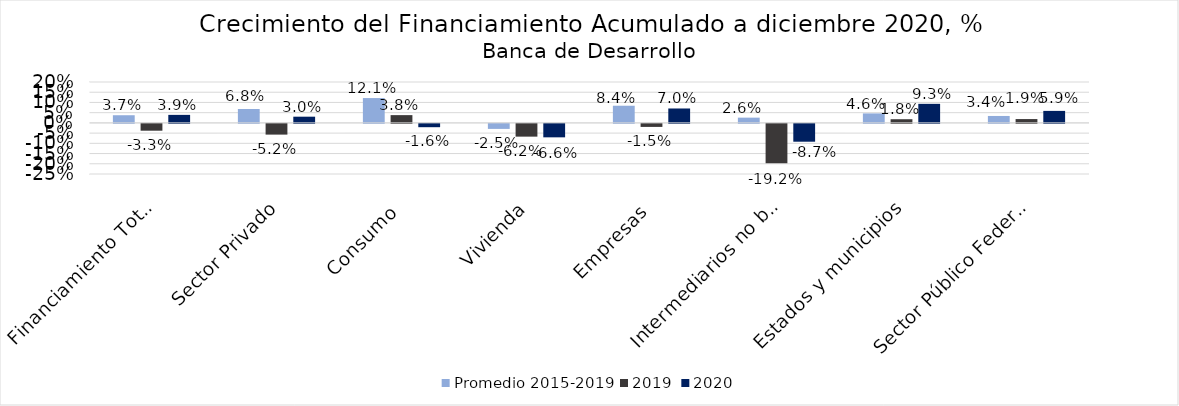
| Category | Promedio 2015-2019 | 2019 | 2020 |
|---|---|---|---|
| Financiamiento Total | 0.037 | -0.033 | 0.039 |
| Sector Privado | 0.068 | -0.052 | 0.03 |
| Consumo | 0.121 | 0.038 | -0.016 |
| Vivienda | -0.025 | -0.062 | -0.066 |
| Empresas | 0.084 | -0.015 | 0.07 |
| Intermediarios no bancarios | 0.026 | -0.192 | -0.087 |
| Estados y municipios | 0.046 | 0.018 | 0.093 |
| Sector Público Federal | 0.034 | 0.019 | 0.059 |